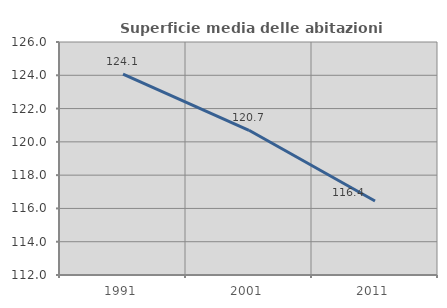
| Category | Superficie media delle abitazioni occupate |
|---|---|
| 1991.0 | 124.07 |
| 2001.0 | 120.696 |
| 2011.0 | 116.45 |